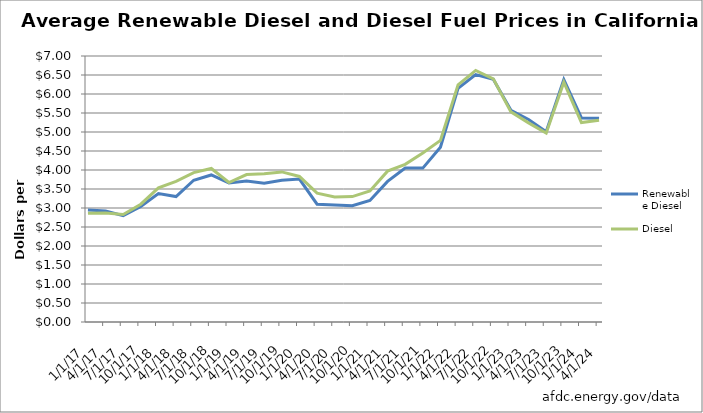
| Category | Renewable Diesel | Diesel |
|---|---|---|
| 1/1/17 | 2.95 | 2.86 |
| 4/1/17 | 2.92 | 2.87 |
| 7/1/17 | 2.8 | 2.83 |
| 10/1/17 | 3.04 | 3.1 |
| 1/1/18 | 3.38 | 3.53 |
| 4/1/18 | 3.3 | 3.7 |
| 7/1/18 | 3.73 | 3.93 |
| 10/1/18 | 3.87 | 4.04 |
| 1/1/19 | 3.66 | 3.67 |
| 4/1/19 | 3.71 | 3.88 |
| 7/1/19 | 3.65 | 3.9 |
| 10/1/19 | 3.73 | 3.95 |
| 1/1/20 | 3.76 | 3.83 |
| 4/1/20 | 3.1 | 3.39 |
| 7/1/20 | 3.08 | 3.29 |
| 10/1/20 | 3.06 | 3.3 |
| 1/1/21 | 3.2 | 3.45 |
| 4/1/21 | 3.7 | 3.97 |
| 7/1/21 | 4.05 | 4.15 |
| 10/1/21 | 4.05 | 4.45 |
| 1/1/22 | 4.6 | 4.78 |
| 4/1/22 | 6.15 | 6.24 |
| 7/1/22 | 6.51 | 6.62 |
| 10/1/22 | 6.39 | 6.4 |
| 1/1/23 | 5.57 | 5.53 |
| 4/1/23 | 5.33 | 5.24 |
| 7/1/23 | 5.01 | 4.97 |
| 10/1/23 | 6.38 | 6.31 |
| 1/1/24 | 5.37 | 5.25 |
| 4/1/24 | 5.36 | 5.31 |